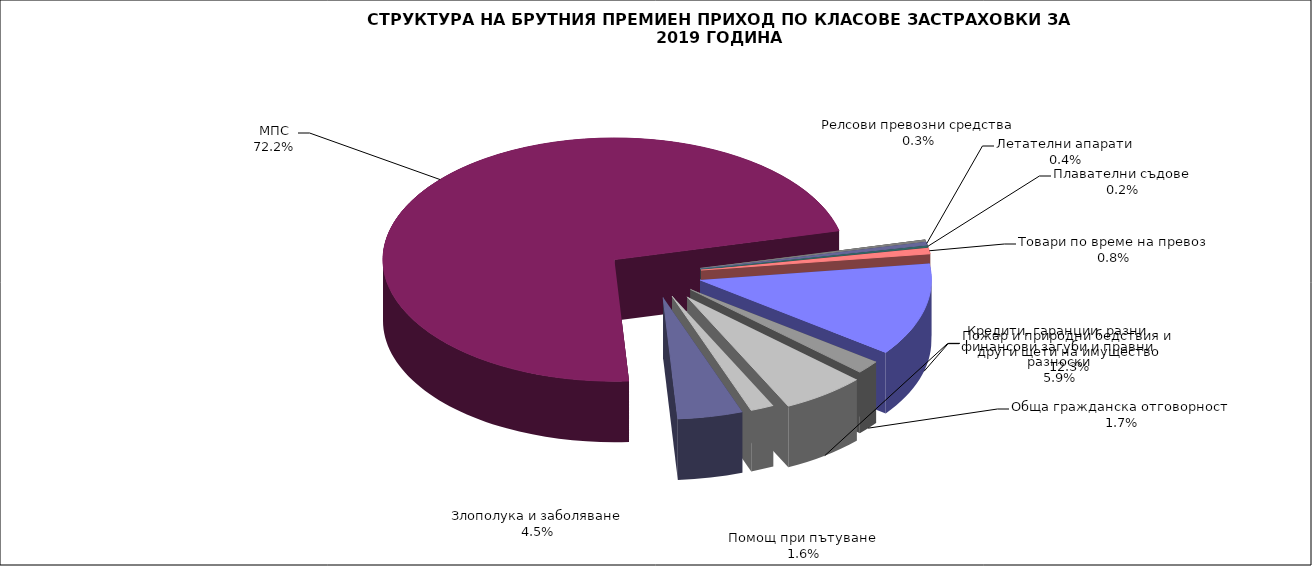
| Category | Series 0 |
|---|---|
| Злополука и заболяване | 0.045 |
| МПС | 0.722 |
| Релсови превозни средства | 0.003 |
| Летателни апарати | 0.004 |
| Плавателни съдове | 0.002 |
| Товари по време на превоз | 0.008 |
| Пожар и природни бедствия и други щети на имущество | 0.123 |
| Обща гражданска отговорност | 0.017 |
| Кредити, гаранции, разни финансови загуби и правни разноски | 0.059 |
| Помощ при пътуване | 0.016 |